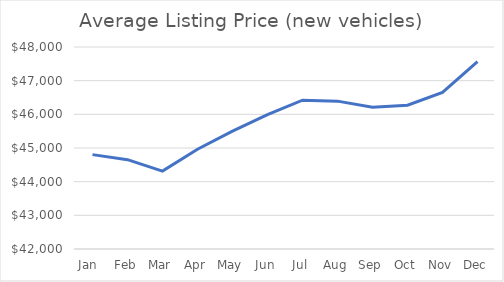
| Category | Series 0 |
|---|---|
| Jan  | 44803 |
| Feb | 44653 |
| Mar | 44315 |
| Apr | 44963 |
| May | 45499 |
| Jun | 45994 |
| Jul | 46421 |
| Aug | 46392 |
| Sep | 46209 |
| Oct | 46270 |
| Nov | 46650 |
| Dec | 47566 |